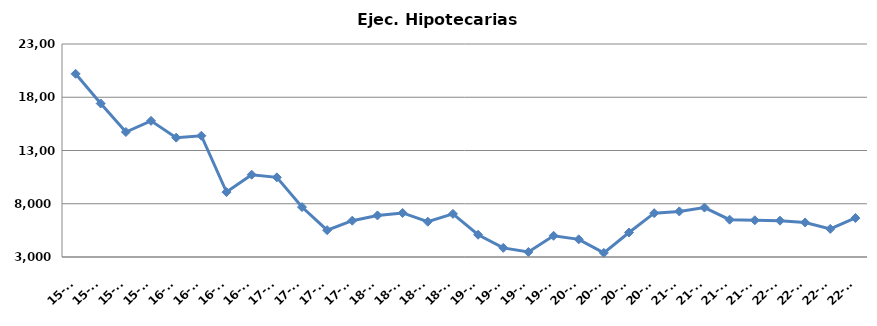
| Category | Ej. Hipotecarias |
|---|---|
| 15-T1 | 20201 |
| 15-T2 | 17414 |
| 15-T3 | 14735 |
| 15-T4 | 15785 |
| 16-T1 | 14205 |
| 16-T2 | 14385 |
| 16-T3 | 9094 |
| 16-T4 | 10726 |
| 17-T1 | 10478 |
| 17-T2 | 7689 |
| 17-T3 | 5518 |
| 17-T4 | 6409 |
| 18-T1 | 6903 |
| 18-T2 | 7137 |
| 18-T3 | 6315 |
| 18-T4 | 7049 |
| 19-T1 | 5092 |
| 19-T2 | 3857 |
| 19-T3 | 3470 |
| 19-T4 | 4992 |
| 20-T1 | 4658 |
| 20-T2 | 3387 |
| 20-T3 | 5299 |
| 20-T4 | 7116 |
| 21-T1 | 7280 |
| 21-T2 | 7641 |
| 21-T3 | 6504 |
| 21-T4 | 6449 |
| 22-T1 | 6410 |
| 22-T2 | 6242 |
| 22-T3 | 5637 |
| 22-T4 | 6663 |